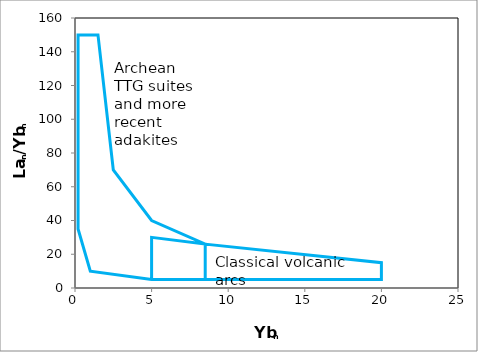
| Category | Series 0 |
|---|---|
| 8.5 | 5 |
| 20.0 | 5 |
| 20.0 | 15 |
| 8.5 | 26 |
| 5.0 | 40 |
| 2.5 | 70 |
| 1.5 | 150 |
| 0.2 | 150 |
| 0.2 | 35 |
| 1.0 | 10 |
| 5.0 | 5 |
| 8.5 | 5 |
| 8.5 | 26 |
| 5.0 | 30 |
| 5.0 | 5 |